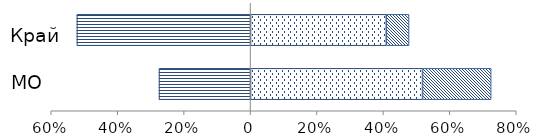
| Category | Ниже базового | Базовый | Повышенный |
|---|---|---|---|
|  | -0.276 | 0.518 | 0.207 |
|  | -0.523 | 0.409 | 0.068 |